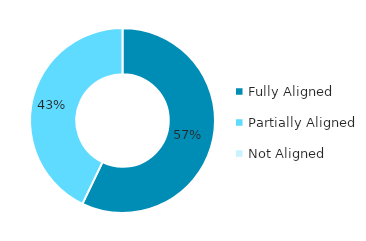
| Category | Series 0 |
|---|---|
| Fully Aligned | 0.571 |
| Partially Aligned | 0.429 |
| Not Aligned | 0 |